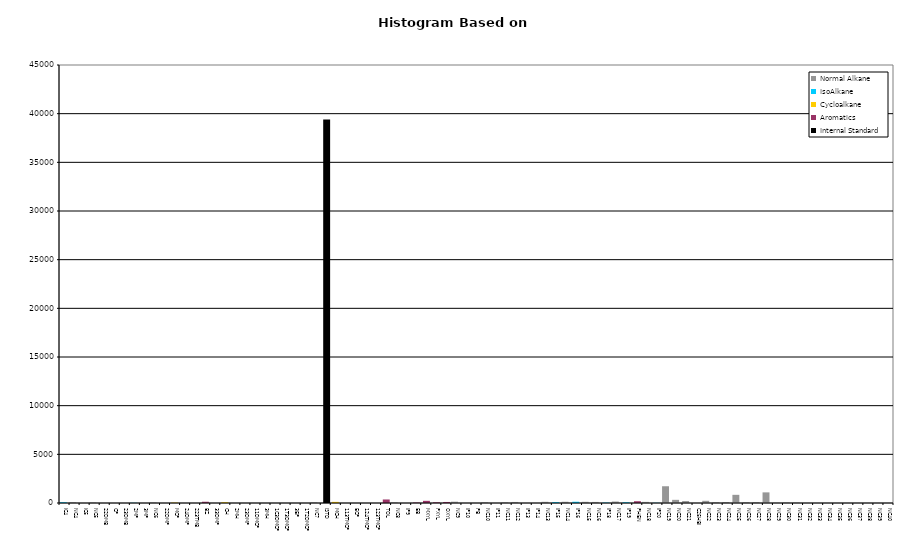
| Category | Normal Alkane | IsoAlkane | Cycloalkane | Aromatics | Internal Standard |
|---|---|---|---|---|---|
| IC4 | 0 | 75 | 0 | 0 | 0 |
| NC4 | 73 | 0 | 0 | 0 | 0 |
| IC5 | 0 | 0 | 0 | 0 | 0 |
| NC5 | 49 | 0 | 0 | 0 | 0 |
| 22DMB | 0 | 0 | 0 | 0 | 0 |
| CP | 0 | 0 | 0 | 0 | 0 |
| 23DMB | 0 | 0 | 0 | 0 | 0 |
| 2MP | 0 | 21 | 0 | 0 | 0 |
| 3MP | 0 | 0 | 0 | 0 | 0 |
| NC6 | 54 | 0 | 0 | 0 | 0 |
| 22DMP | 0 | 0 | 0 | 0 | 0 |
| MCP | 0 | 0 | 41 | 0 | 0 |
| 24DMP | 0 | 0 | 0 | 0 | 0 |
| 223TMB | 0 | 0 | 0 | 0 | 0 |
| BZ | 0 | 0 | 0 | 129 | 0 |
| 33DMP | 0 | 0 | 0 | 0 | 0 |
| CH | 0 | 0 | 79 | 0 | 0 |
| 2MH | 0 | 0 | 0 | 0 | 0 |
| 23DMP | 0 | 0 | 0 | 0 | 0 |
| 11DMCP | 0 | 0 | 0 | 0 | 0 |
| 3MH | 0 | 0 | 0 | 0 | 0 |
| 1C3DMCP | 0 | 0 | 0 | 0 | 0 |
| 1T3DMCP | 0 | 0 | 0 | 0 | 0 |
| 3EP | 0 | 0 | 0 | 0 | 0 |
| 1T2DMCP | 0 | 0 | 0 | 0 | 0 |
| NC7 | 62 | 0 | 0 | 0 | 0 |
| ISTD | 0 | 0 | 0 | 0 | 39407 |
| MCH | 0 | 0 | 116 | 0 | 0 |
| 113TMCP | 0 | 0 | 0 | 0 | 0 |
| ECP | 0 | 0 | 0 | 0 | 0 |
| 124TMCP | 0 | 0 | 0 | 0 | 0 |
| 123TMCP | 0 | 0 | 0 | 0 | 0 |
| TOL | 0 | 0 | 0 | 361 | 0 |
| NC8 | 70 | 0 | 0 | 0 | 0 |
| IP9 | 0 | 0 | 0 | 0 | 0 |
| EB | 0 | 0 | 0 | 49 | 0 |
| MXYL | 0 | 0 | 0 | 222 | 0 |
| PXYL | 0 | 0 | 0 | 74 | 0 |
| OXYL | 0 | 0 | 0 | 106 | 0 |
| NC9 | 133 | 0 | 0 | 0 | 0 |
| IP10 | 0 | 0 | 0 | 0 | 0 |
| PB | 0 | 0 | 0 | 0 | 0 |
| NC10 | 74 | 0 | 0 | 0 | 0 |
| IP11 | 0 | 0 | 0 | 0 | 0 |
| NC11 | 65 | 0 | 0 | 0 | 0 |
| NC12 | 106 | 0 | 0 | 0 | 0 |
| IP13 | 0 | 0 | 0 | 0 | 0 |
| IP14 | 0 | 0 | 0 | 0 | 0 |
| NC13 | 121 | 0 | 0 | 0 | 0 |
| IP15 | 0 | 89 | 0 | 0 | 0 |
| NC14 | 126 | 0 | 0 | 0 | 0 |
| IP16 | 0 | 129 | 0 | 0 | 0 |
| NC15 | 121 | 0 | 0 | 0 | 0 |
| NC16 | 109 | 0 | 0 | 0 | 0 |
| IP18 | 0 | 44 | 0 | 0 | 0 |
| NC17 | 150 | 0 | 0 | 0 | 0 |
| IP19 | 0 | 75 | 0 | 0 | 0 |
| PHEN | 0 | 0 | 0 | 182 | 0 |
| NC18 | 114 | 0 | 0 | 0 | 0 |
| IP20 | 0 | 20 | 0 | 0 | 0 |
| NC19 | 1721 | 0 | 0 | 0 | 0 |
| NC20 | 325 | 0 | 0 | 0 | 0 |
| NC21 | 202 | 0 | 0 | 0 | 0 |
| C25HBI | 0 | 0 | 0 | 0 | 0 |
| NC22 | 225 | 0 | 0 | 0 | 0 |
| NC23 | 81 | 0 | 0 | 0 | 0 |
| NC24 | 105 | 0 | 0 | 0 | 0 |
| NC25 | 839 | 0 | 0 | 0 | 0 |
| NC26 | 82 | 0 | 0 | 0 | 0 |
| NC27 | 95 | 0 | 0 | 0 | 0 |
| NC28 | 1092 | 0 | 0 | 0 | 0 |
| NC29 | 22 | 0 | 0 | 0 | 0 |
| NC30 | 51 | 0 | 0 | 0 | 0 |
| NC31 | 39 | 0 | 0 | 0 | 0 |
| NC32 | 0 | 0 | 0 | 0 | 0 |
| NC33 | 0 | 0 | 0 | 0 | 0 |
| NC34 | 0 | 0 | 0 | 0 | 0 |
| NC35 | 0 | 0 | 0 | 0 | 0 |
| NC36 | 0 | 0 | 0 | 0 | 0 |
| NC37 | 0 | 0 | 0 | 0 | 0 |
| NC38 | 0 | 0 | 0 | 0 | 0 |
| NC39 | 0 | 0 | 0 | 0 | 0 |
| NC40 | 0 | 0 | 0 | 0 | 0 |